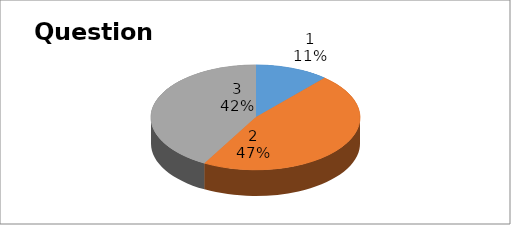
| Category | Series 0 |
|---|---|
| 0 | 24 |
| 1 | 98 |
| 2 | 88 |